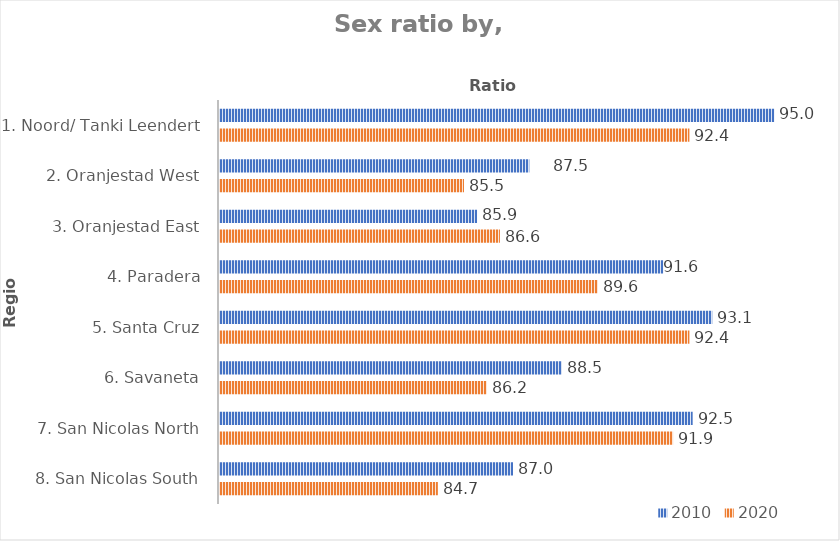
| Category | 2010 | 2020 |
|---|---|---|
| 1. Noord/ Tanki Leendert | 95 | 92.4 |
| 2. Oranjestad West | 87.5 | 85.5 |
| 3. Oranjestad East | 85.9 | 86.6 |
| 4. Paradera | 91.6 | 89.6 |
| 5. Santa Cruz | 93.1 | 92.4 |
| 6. Savaneta | 88.5 | 86.2 |
| 7. San Nicolas North | 92.5 | 91.9 |
| 8. San Nicolas South | 87 | 84.7 |